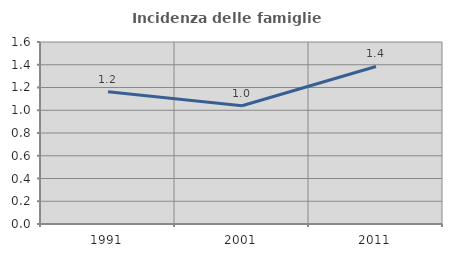
| Category | Incidenza delle famiglie numerose |
|---|---|
| 1991.0 | 1.163 |
| 2001.0 | 1.039 |
| 2011.0 | 1.385 |